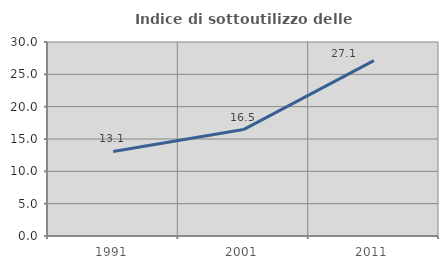
| Category | Indice di sottoutilizzo delle abitazioni  |
|---|---|
| 1991.0 | 13.07 |
| 2001.0 | 16.457 |
| 2011.0 | 27.112 |